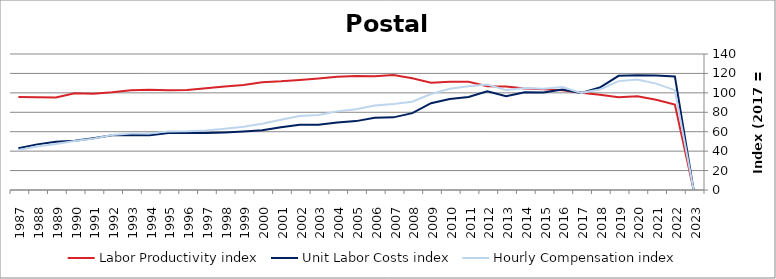
| Category | Labor Productivity index | Unit Labor Costs index | Hourly Compensation index |
|---|---|---|---|
| 2023.0 | 0 | 0 | 0 |
| 2022.0 | 87.921 | 116.912 | 102.79 |
| 2021.0 | 92.968 | 117.784 | 109.501 |
| 2020.0 | 96.385 | 118.111 | 113.841 |
| 2019.0 | 95.393 | 117.501 | 112.087 |
| 2018.0 | 98.098 | 105.484 | 103.478 |
| 2017.0 | 100 | 100 | 100 |
| 2016.0 | 102.559 | 103.381 | 106.026 |
| 2015.0 | 103.83 | 100.413 | 104.259 |
| 2014.0 | 104.393 | 100.571 | 104.99 |
| 2013.0 | 106.645 | 96.439 | 102.847 |
| 2012.0 | 106.901 | 101.595 | 108.606 |
| 2011.0 | 111.517 | 95.79 | 106.822 |
| 2010.0 | 111.413 | 93.626 | 104.311 |
| 2009.0 | 110.507 | 89.366 | 98.756 |
| 2008.0 | 114.95 | 79.121 | 90.949 |
| 2007.0 | 118.486 | 74.777 | 88.6 |
| 2006.0 | 117.08 | 74.337 | 87.033 |
| 2005.0 | 117.232 | 70.91 | 83.13 |
| 2004.0 | 116.662 | 69.385 | 80.946 |
| 2003.0 | 114.833 | 67.19 | 77.156 |
| 2002.0 | 113.354 | 67.24 | 76.219 |
| 2001.0 | 111.909 | 64.593 | 72.286 |
| 2000.0 | 110.996 | 61.504 | 68.268 |
| 1999.0 | 108.056 | 60.178 | 65.026 |
| 1998.0 | 106.444 | 59.233 | 63.049 |
| 1997.0 | 104.705 | 58.607 | 61.364 |
| 1996.0 | 103.036 | 58.719 | 60.502 |
| 1995.0 | 102.675 | 58.772 | 60.344 |
| 1994.0 | 103.317 | 56.335 | 58.203 |
| 1993.0 | 102.607 | 56.602 | 58.078 |
| 1992.0 | 100.58 | 56.322 | 56.648 |
| 1991.0 | 99.188 | 53.327 | 52.894 |
| 1990.0 | 99.652 | 50.608 | 50.431 |
| 1989.0 | 95.349 | 49.667 | 47.357 |
| 1988.0 | 95.486 | 46.959 | 44.84 |
| 1987.0 | 95.801 | 42.888 | 41.087 |